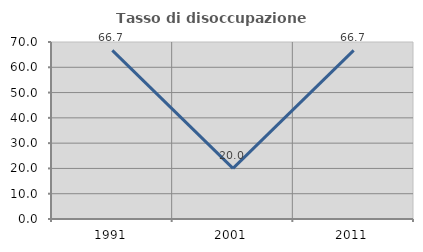
| Category | Tasso di disoccupazione giovanile  |
|---|---|
| 1991.0 | 66.667 |
| 2001.0 | 20 |
| 2011.0 | 66.667 |